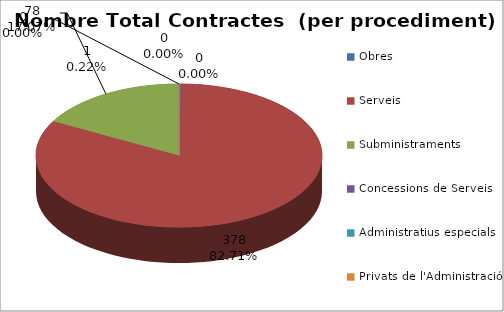
| Category | Nombre Total Contractes |
|---|---|
| Obres | 1 |
| Serveis | 378 |
| Subministraments | 78 |
| Concessions de Serveis | 0 |
| Administratius especials | 0 |
| Privats de l'Administració | 0 |